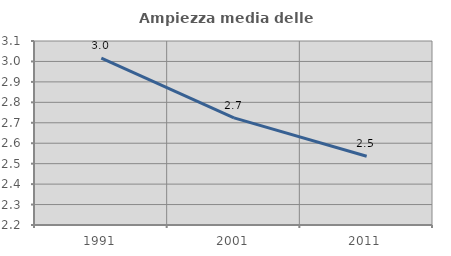
| Category | Ampiezza media delle famiglie |
|---|---|
| 1991.0 | 3.017 |
| 2001.0 | 2.724 |
| 2011.0 | 2.537 |